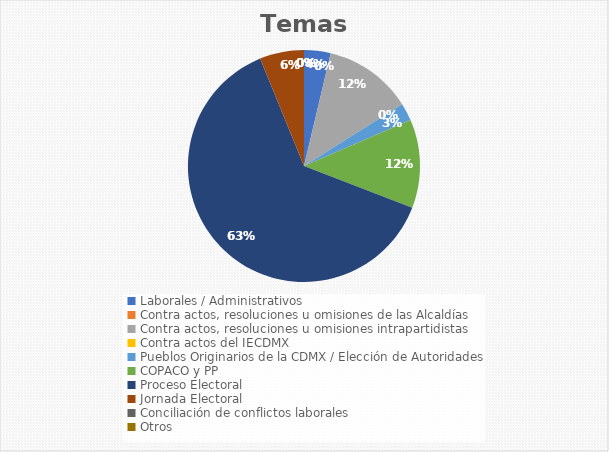
| Category | Temas |
|---|---|
| Laborales / Administrativos | 3 |
| Contra actos, resoluciones u omisiones de las Alcaldías | 0 |
| Contra actos, resoluciones u omisiones intrapartidistas | 10 |
| Contra actos del IECDMX | 0 |
| Pueblos Originarios de la CDMX / Elección de Autoridades | 2 |
| COPACO y PP | 10 |
| Proceso Electoral | 51 |
| Jornada Electoral | 5 |
| Conciliación de conflictos laborales | 0 |
| Otros | 0 |